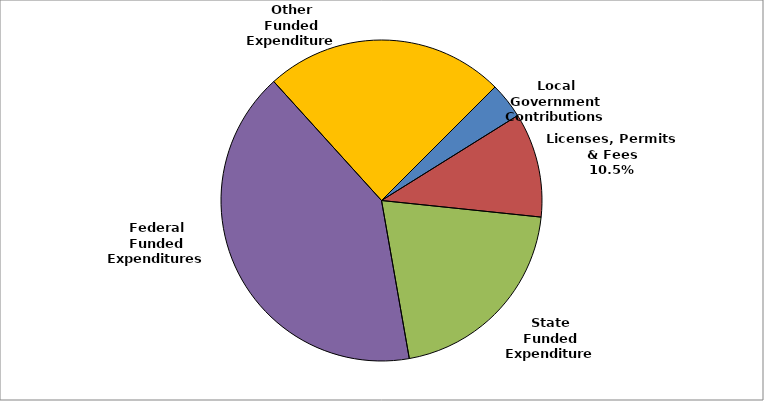
| Category | Series 0 |
|---|---|
| Local Government Contributions | 0.036 |
| Licenses, Permits & Fees | 0.105 |
| State Funded Expenditures | 0.206 |
| Federal Funded Expenditures | 0.411 |
| Other Funded Expenditures | 0.242 |